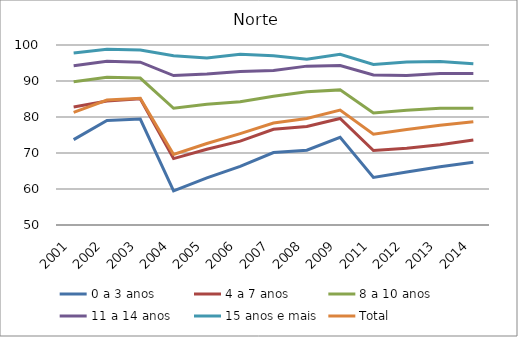
| Category | 0 a 3 anos | 4 a 7 anos | 8 a 10 anos | 11 a 14 anos | 15 anos e mais | Total |
|---|---|---|---|---|---|---|
| 2001.0 | 73.71 | 82.78 | 89.79 | 94.23 | 97.78 | 81.31 |
| 2002.0 | 79.04 | 84.43 | 91.05 | 95.48 | 98.82 | 84.73 |
| 2003.0 | 79.41 | 85.07 | 90.82 | 95.23 | 98.6 | 85.21 |
| 2004.0 | 59.47 | 68.45 | 82.42 | 91.5 | 97 | 69.58 |
| 2005.0 | 63.08 | 71.04 | 83.52 | 91.92 | 96.42 | 72.63 |
| 2006.0 | 66.26 | 73.29 | 84.21 | 92.64 | 97.4 | 75.38 |
| 2007.0 | 70.13 | 76.6 | 85.79 | 92.94 | 97.02 | 78.34 |
| 2008.0 | 70.77 | 77.38 | 86.99 | 94.13 | 96.03 | 79.61 |
| 2009.0 | 74.35 | 79.6 | 87.53 | 94.3 | 97.44 | 81.9 |
| 2011.0 | 63.2 | 70.7 | 81.1 | 91.7 | 94.6 | 75.2 |
| 2012.0 | 64.7 | 71.3 | 81.9 | 91.5 | 95.3 | 76.5 |
| 2013.0 | 66.2 | 72.3 | 82.4 | 92.1 | 95.4 | 77.7 |
| 2014.0 | 67.4 | 73.6 | 82.4 | 92.1 | 94.8 | 78.7 |